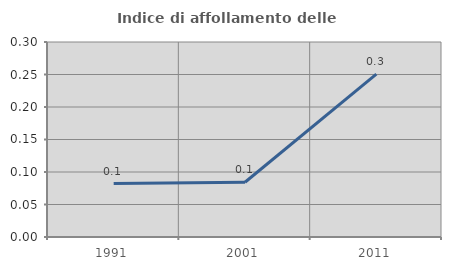
| Category | Indice di affollamento delle abitazioni  |
|---|---|
| 1991.0 | 0.082 |
| 2001.0 | 0.084 |
| 2011.0 | 0.251 |